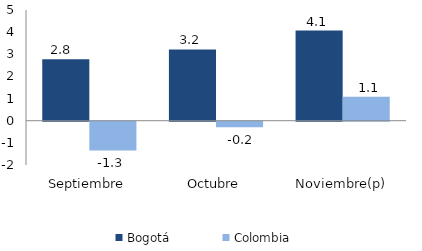
| Category | Bogotá | Colombia |
|---|---|---|
| Septiembre | 2.781 | -1.299 |
| Octubre | 3.219 | -0.249 |
| Noviembre(p) | 4.071 | 1.084 |